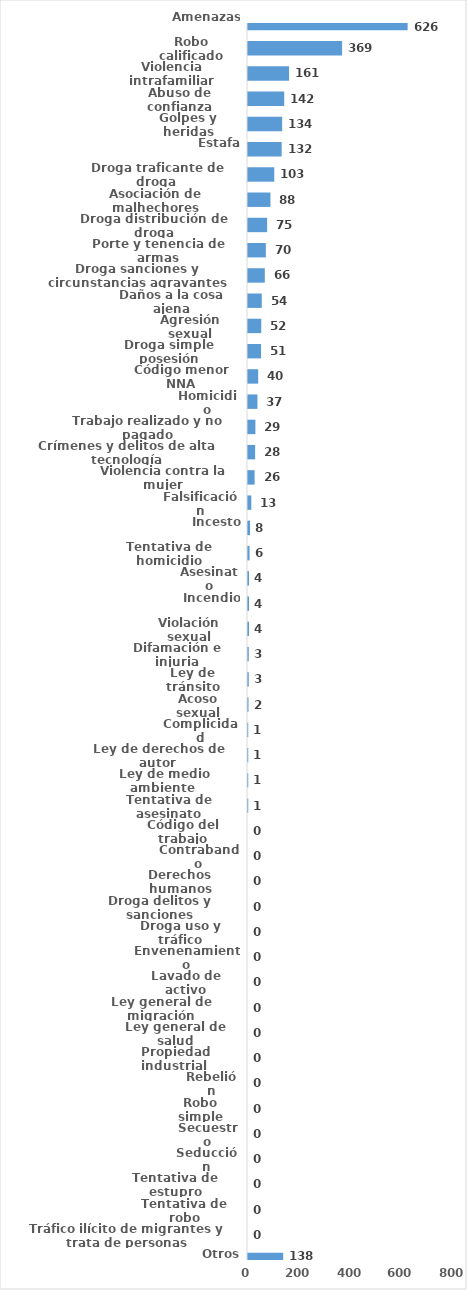
| Category | Series 0 |
|---|---|
| Amenazas | 626 |
| Robo calificado | 369 |
| Violencia intrafamiliar | 161 |
| Abuso de confianza | 142 |
| Golpes y heridas | 134 |
| Estafa | 132 |
| Droga traficante de droga  | 103 |
| Asociación de malhechores | 88 |
| Droga distribución de droga | 75 |
| Porte y tenencia de armas | 70 |
| Droga sanciones y circunstancias agravantes | 66 |
| Daños a la cosa ajena | 54 |
| Agresión sexual | 52 |
| Droga simple posesión | 51 |
| Código menor NNA | 40 |
| Homicidio | 37 |
| Trabajo realizado y no pagado | 29 |
| Crímenes y delitos de alta tecnología | 28 |
| Violencia contra la mujer | 26 |
| Falsificación | 13 |
| Incesto | 8 |
| Tentativa de homicidio | 6 |
| Asesinato | 4 |
| Incendio | 4 |
| Violación sexual | 4 |
| Difamación e injuria | 3 |
| Ley de tránsito | 3 |
| Acoso sexual | 2 |
| Complicidad | 1 |
| Ley de derechos de autor  | 1 |
| Ley de medio ambiente  | 1 |
| Tentativa de asesinato | 1 |
| Código del trabajo | 0 |
| Contrabando | 0 |
| Derechos humanos | 0 |
| Droga delitos y sanciones | 0 |
| Droga uso y tráfico | 0 |
| Envenenamiento | 0 |
| Lavado de activo | 0 |
| Ley general de migración | 0 |
| Ley general de salud | 0 |
| Propiedad industrial  | 0 |
| Rebelión | 0 |
| Robo simple | 0 |
| Secuestro | 0 |
| Seducción | 0 |
| Tentativa de estupro | 0 |
| Tentativa de robo | 0 |
| Tráfico ilícito de migrantes y trata de personas | 0 |
| Otros | 138 |